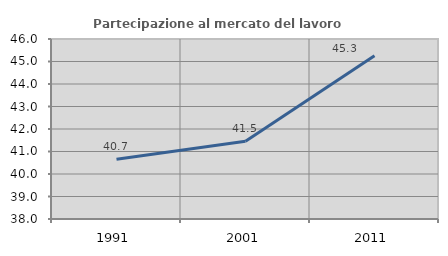
| Category | Partecipazione al mercato del lavoro  femminile |
|---|---|
| 1991.0 | 40.654 |
| 2001.0 | 41.453 |
| 2011.0 | 45.256 |